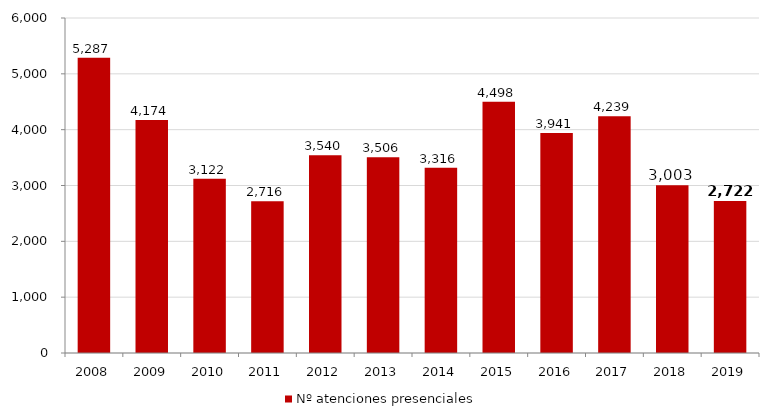
| Category | Nº atenciones presenciales |
|---|---|
| 2008.0 | 5287 |
| 2009.0 | 4174 |
| 2010.0 | 3122 |
| 2011.0 | 2716 |
| 2012.0 | 3540 |
| 2013.0 | 3506 |
| 2014.0 | 3316 |
| 2015.0 | 4498 |
| 2016.0 | 3941 |
| 2017.0 | 4239 |
| 2018.0 | 3003 |
| 2019.0 | 2722 |